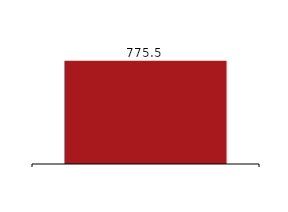
| Category | Risk exposure amount (ISKm) |
|---|---|
|  | 775492 |